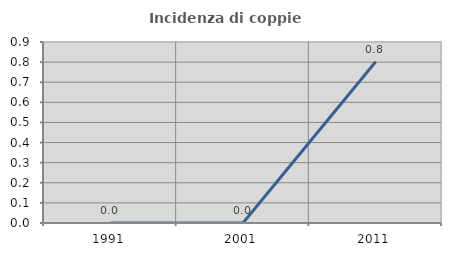
| Category | Incidenza di coppie miste |
|---|---|
| 1991.0 | 0 |
| 2001.0 | 0 |
| 2011.0 | 0.802 |